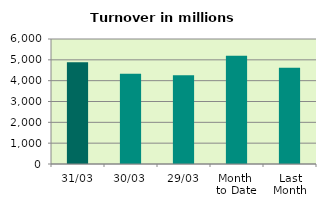
| Category | Series 0 |
|---|---|
| 31/03 | 4881.311 |
| 30/03 | 4327.543 |
| 29/03 | 4255.232 |
| Month 
to Date | 5192.573 |
| Last
Month | 4623.097 |